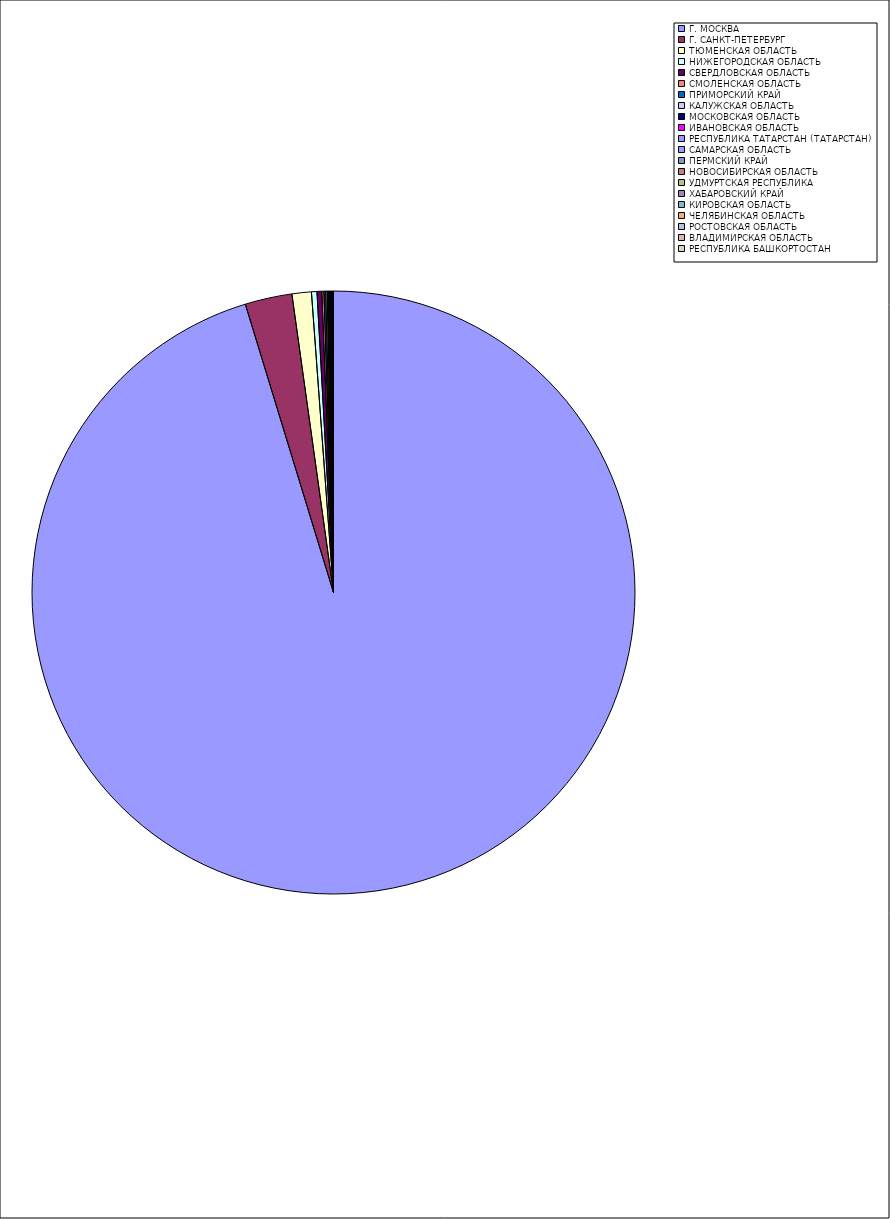
| Category | Оборот |
|---|---|
| Г. МОСКВА | 95.221 |
| Г. САНКТ-ПЕТЕРБУРГ | 2.516 |
| ТЮМЕНСКАЯ ОБЛАСТЬ | 1.037 |
| НИЖЕГОРОДСКАЯ ОБЛАСТЬ | 0.293 |
| СВЕРДЛОВСКАЯ ОБЛАСТЬ | 0.257 |
| СМОЛЕНСКАЯ ОБЛАСТЬ | 0.111 |
| ПРИМОРСКИЙ КРАЙ | 0.092 |
| КАЛУЖСКАЯ ОБЛАСТЬ | 0.079 |
| МОСКОВСКАЯ ОБЛАСТЬ | 0.069 |
| ИВАНОВСКАЯ ОБЛАСТЬ | 0.053 |
| РЕСПУБЛИКА ТАТАРСТАН (ТАТАРСТАН) | 0.052 |
| САМАРСКАЯ ОБЛАСТЬ | 0.043 |
| ПЕРМСКИЙ КРАЙ | 0.033 |
| НОВОСИБИРСКАЯ ОБЛАСТЬ | 0.022 |
| УДМУРТСКАЯ РЕСПУБЛИКА | 0.017 |
| ХАБАРОВСКИЙ КРАЙ | 0.013 |
| КИРОВСКАЯ ОБЛАСТЬ | 0.01 |
| ЧЕЛЯБИНСКАЯ ОБЛАСТЬ | 0.007 |
| РОСТОВСКАЯ ОБЛАСТЬ | 0.007 |
| ВЛАДИМИРСКАЯ ОБЛАСТЬ | 0.005 |
| РЕСПУБЛИКА БАШКОРТОСТАН | 0.005 |